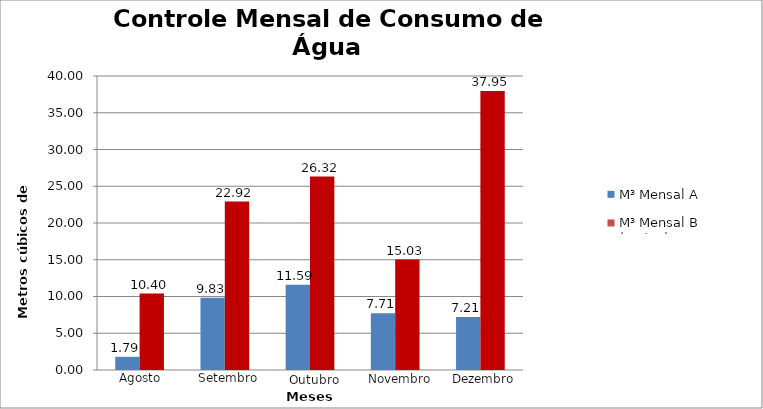
| Category | M³ Mensal A | M³ Mensal B (Reúso) |
|---|---|---|
| 0 | 1.79 | 10.4 |
| 1900-01-01 | 9.83 | 22.92 |
| 1900-01-02 | 11.59 | 26.32 |
| 1900-01-03 | 7.71 | 15.03 |
| 1900-01-04 | 7.21 | 37.95 |